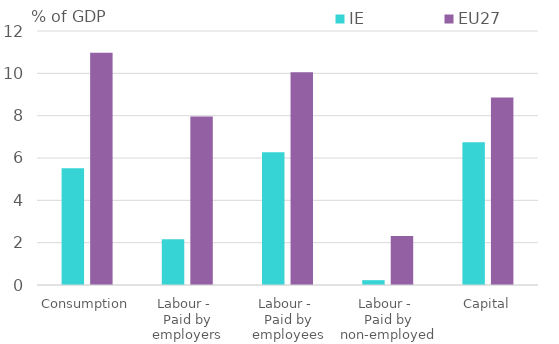
| Category | IE | EU27 |
|---|---|---|
| Consumption | 5.512 | 10.967 |
| Labour - 
Paid by employers | 2.162 | 7.966 |
| Labour - 
Paid by employees | 6.273 | 10.052 |
| Labour - 
Paid by non-employed | 0.228 | 2.311 |
| Capital | 6.745 | 8.858 |